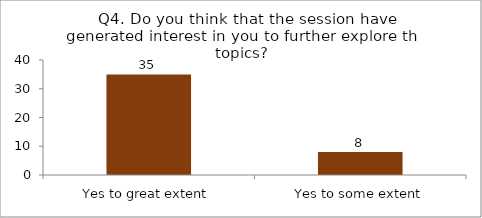
| Category | Q4. Do you think that the session have generated interest in you to further explore the topics? |
|---|---|
| Yes to great extent | 35 |
| Yes to some extent | 8 |